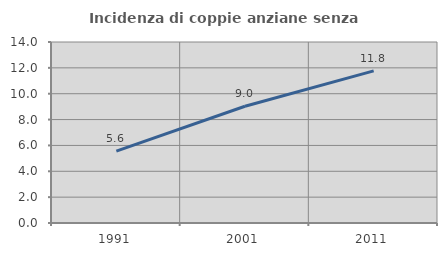
| Category | Incidenza di coppie anziane senza figli  |
|---|---|
| 1991.0 | 5.559 |
| 2001.0 | 9.033 |
| 2011.0 | 11.77 |